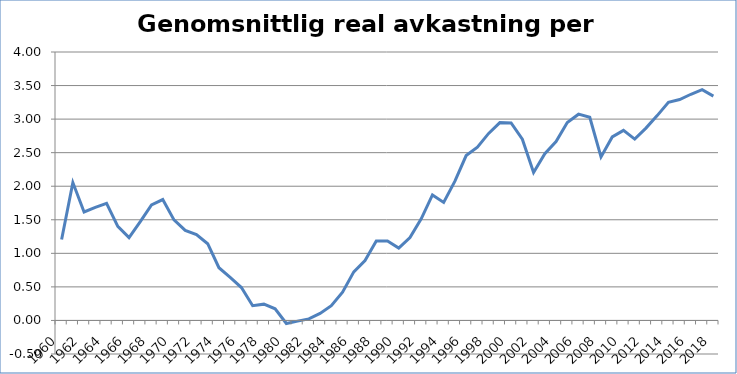
| Category | Genomsnittlig real  |
|---|---|
| 1960.0 | 1.207 |
| 1961.0 | 2.054 |
| 1962.0 | 1.616 |
| 1963.0 | 1.686 |
| 1964.0 | 1.746 |
| 1965.0 | 1.401 |
| 1966.0 | 1.234 |
| 1967.0 | 1.471 |
| 1968.0 | 1.721 |
| 1969.0 | 1.802 |
| 1970.0 | 1.498 |
| 1971.0 | 1.341 |
| 1972.0 | 1.278 |
| 1973.0 | 1.143 |
| 1974.0 | 0.785 |
| 1975.0 | 0.641 |
| 1976.0 | 0.49 |
| 1977.0 | 0.22 |
| 1978.0 | 0.243 |
| 1979.0 | 0.173 |
| 1980.0 | -0.046 |
| 1981.0 | -0.01 |
| 1982.0 | 0.024 |
| 1983.0 | 0.105 |
| 1984.0 | 0.219 |
| 1985.0 | 0.422 |
| 1986.0 | 0.724 |
| 1987.0 | 0.893 |
| 1988.0 | 1.183 |
| 1989.0 | 1.183 |
| 1990.0 | 1.079 |
| 1991.0 | 1.236 |
| 1992.0 | 1.514 |
| 1993.0 | 1.87 |
| 1994.0 | 1.759 |
| 1995.0 | 2.075 |
| 1996.0 | 2.457 |
| 1997.0 | 2.583 |
| 1998.0 | 2.787 |
| 1999.0 | 2.948 |
| 2000.0 | 2.944 |
| 2001.0 | 2.701 |
| 2002.0 | 2.205 |
| 2003.0 | 2.484 |
| 2004.0 | 2.665 |
| 2005.0 | 2.949 |
| 2006.0 | 3.074 |
| 2007.0 | 3.027 |
| 2008.0 | 2.437 |
| 2009.0 | 2.735 |
| 2010.0 | 2.832 |
| 2011.0 | 2.702 |
| 2012.0 | 2.866 |
| 2013.0 | 3.052 |
| 2014.0 | 3.25 |
| 2015.0 | 3.292 |
| 2016.0 | 3.37 |
| 2017.0 | 3.438 |
| 2018.0 | 3.343 |